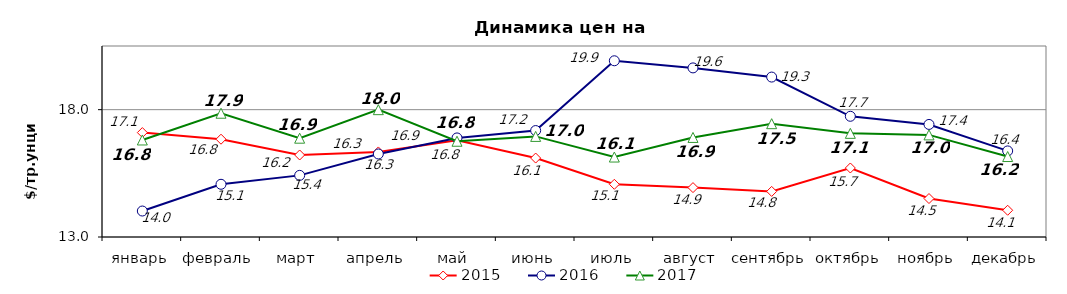
| Category | 2015 | 2016 | 2017 |
|---|---|---|---|
| январь | 17.1 | 14.02 | 16.81 |
| февраль | 16.84 | 15.07 | 17.86 |
| март | 16.22 | 15.42 | 16.88 |
| апрель | 16.34 | 16.26 | 18 |
| май | 16.8 | 16.89 | 16.76 |
| июнь | 16.1 | 17.18 | 16.95 |
| июль | 15.07 | 19.92 | 16.14 |
| август | 14.94 | 19.64 | 16.91 |
| сентябрь | 14.79 | 19.28 | 17.45 |
| октябрь | 15.71 | 17.74 | 17.07 |
| ноябрь | 14.51 | 17.42 | 17.01 |
| декабрь | 14.05 | 16.38 | 16.16 |